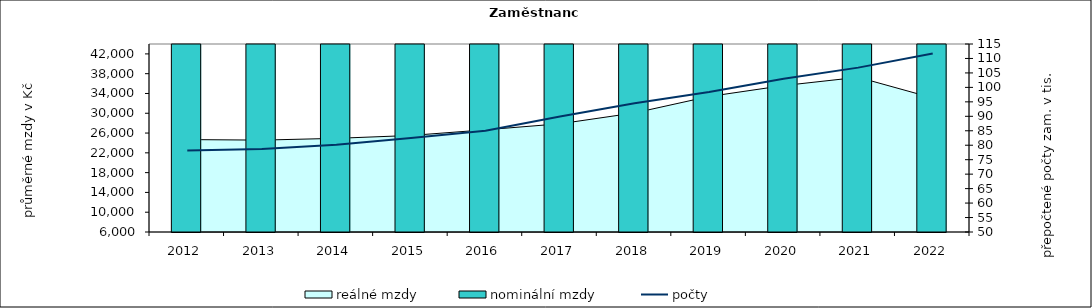
| Category | nominální mzdy  |
|---|---|
| 2012.0 | 24160.726 |
| 2013.0 | 24398.544 |
| 2014.0 | 24856.443 |
| 2015.0 | 25513.412 |
| 2016.0 | 26841.64 |
| 2017.0 | 28741.281 |
| 2018.0 | 31661.8 |
| 2019.0 | 36163.851 |
| 2020.0 | 39797.441 |
| 2021.0 | 42899.823 |
| 2022.0 | 43087.295 |